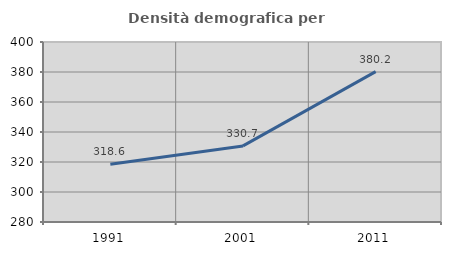
| Category | Densità demografica |
|---|---|
| 1991.0 | 318.565 |
| 2001.0 | 330.735 |
| 2011.0 | 380.245 |